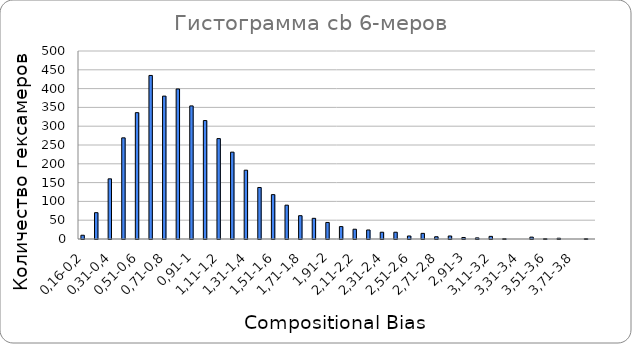
| Category | Series 0 | Series 1 |
|---|---|---|
| 0,16-0,2 | 10 | 0 |
| 0,21-0,3 | 70 | 0 |
| 0,31-0,4 | 160 | 0 |
| 0,41-0,5 | 269 | 0 |
| 0,51-0,6 | 336 | 0 |
| 0,61-0,7 | 435 | 0 |
| 0,71-0,8 | 380 | 0 |
| 0,81-0,9 | 399 | 0 |
| 0,91-1 | 354 | 0 |
| 1,01-1,1 | 315 | 0 |
| 1,11-1,2 | 267 | 0 |
| 1,21-1,3 | 231 | 0 |
| 1,31-1,4 | 183 | 0 |
| 1,41-1,5 | 137 | 0 |
| 1,51-1,6 | 118 | 0 |
| 1,61-1,7 | 90 | 0 |
| 1,71-1,8 | 62 | 0 |
| 1,81-1,9 | 55 | 0 |
| 1,91-2 | 44 | 0 |
| 2,01-2,1 | 33 | 0 |
| 2,11-2,2 | 26 | 0 |
| 2,21-2,3 | 24 | 0 |
| 2,31-2,4 | 18 | 0 |
| 2,41-2,5 | 18 | 0 |
| 2,51-2,6 | 8 | 0 |
| 2,61-2,7 | 15 | 0 |
| 2,71-2,8 | 6 | 0 |
| 2,81-2,9 | 8 | 0 |
| 2,91-3 | 4 | 0 |
| 3,01-3,1 | 3 | 0 |
| 3,11-3,2 | 7 | 0 |
| 3,21-3,3 | 1 | 0 |
| 3,31-3,4 | 0 | 0 |
| 3,41-3,5 | 5 | 0 |
| 3,51-3,6 | 1 | 0 |
| 3,61-3,7 | 2 | 0 |
| 3,71-3,8 | 0 | 0 |
| 3,81-3,9 | 1 | 0 |